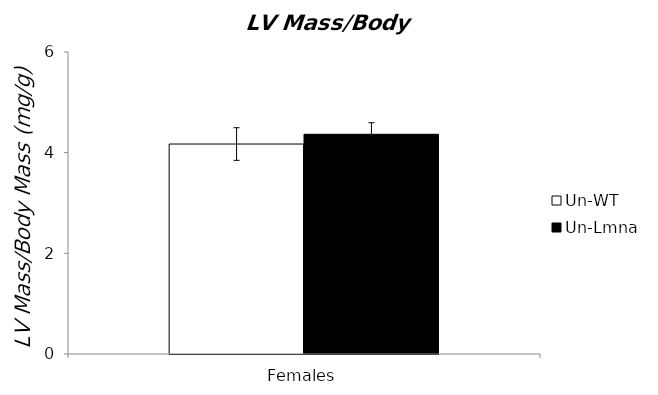
| Category | Un-WT | Un-Lmna |
|---|---|---|
| 0 | 4.172 | 4.365 |